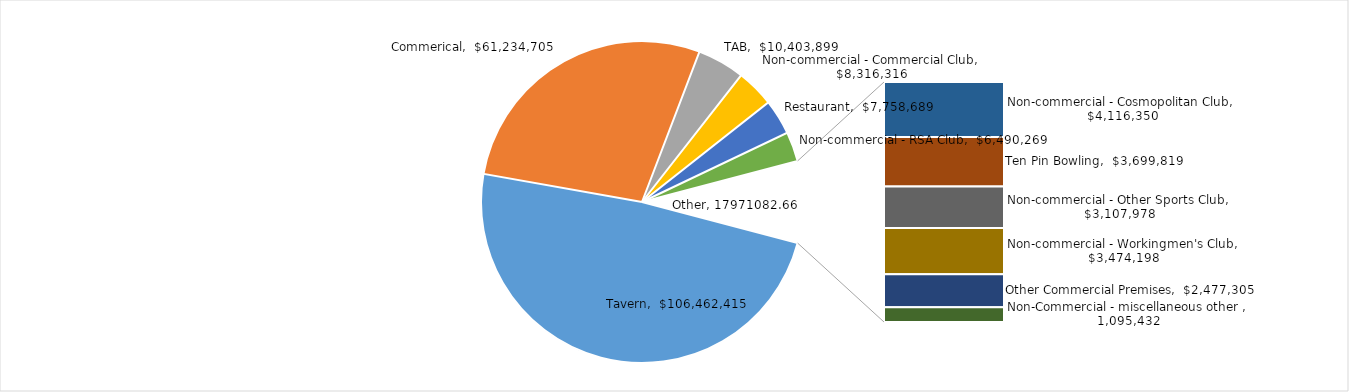
| Category | Total GMP |
|---|---|
| Tavern | 106462415.41 |
| Commerical | 61234705.17 |
| TAB | 10403898.94 |
| Non-commercial - Commercial Club | 8316315.75 |
| Restaurant | 7758688.84 |
| Non-commercial - RSA Club | 6490269.36 |
| Non-commercial - Cosmopolitan Club | 4116350.34 |
| Ten Pin Bowling | 3699818.82 |
| Non-commercial - Other Sports Club | 3107978.4 |
| Non-commercial - Workingmen's Club | 3474197.61 |
| Other Commercial Premises | 2477305.35 |
| Non-Commercial - miscellaneous other  | 1095432.14 |